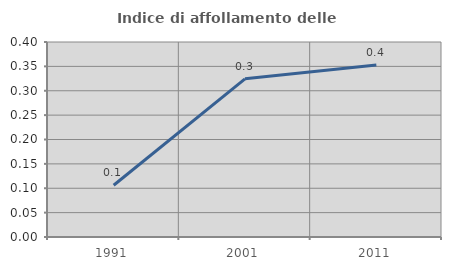
| Category | Indice di affollamento delle abitazioni  |
|---|---|
| 1991.0 | 0.106 |
| 2001.0 | 0.325 |
| 2011.0 | 0.353 |